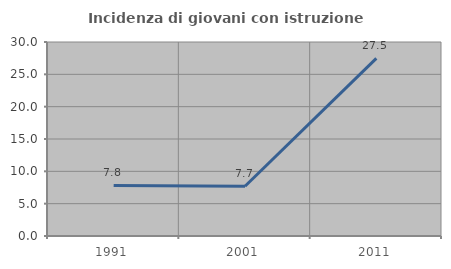
| Category | Incidenza di giovani con istruzione universitaria |
|---|---|
| 1991.0 | 7.826 |
| 2001.0 | 7.692 |
| 2011.0 | 27.473 |